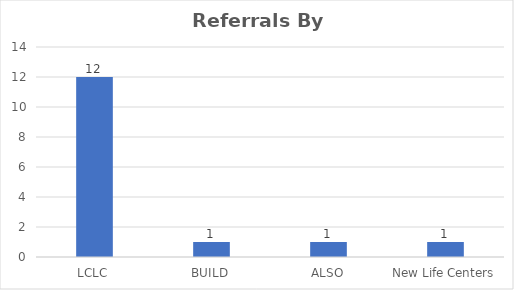
| Category | Series 0 |
|---|---|
| LCLC | 12 |
| BUILD | 1 |
| ALSO | 1 |
| New Life Centers | 1 |